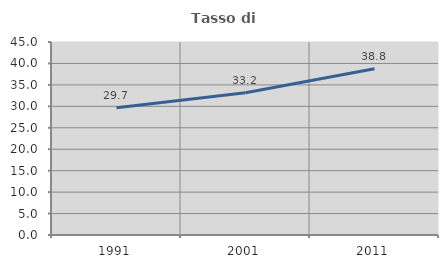
| Category | Tasso di occupazione   |
|---|---|
| 1991.0 | 29.663 |
| 2001.0 | 33.181 |
| 2011.0 | 38.758 |